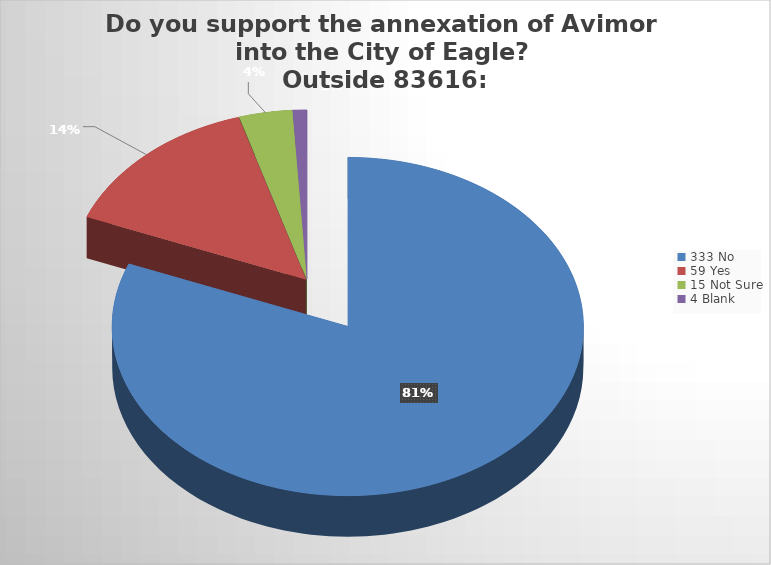
| Category | Series 0 |
|---|---|
| 0 | 0.81 |
| 1 | 0.144 |
| 2 | 0.036 |
| 3 | 0.01 |